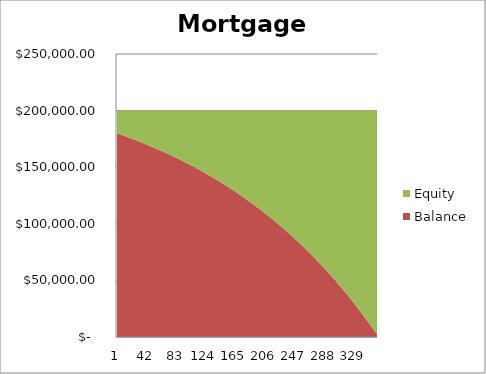
| Category | Balance | Equity |
|---|---|---|
| 0 | 180000 | 20000 |
| 1 | 179773.535 | 20226.465 |
| 2 | 179546.173 | 20453.827 |
| 3 | 179317.912 | 20682.088 |
| 4 | 179088.746 | 20911.254 |
| 5 | 178858.674 | 21141.326 |
| 6 | 178627.691 | 21372.309 |
| 7 | 178395.794 | 21604.206 |
| 8 | 178162.979 | 21837.021 |
| 9 | 177929.242 | 22070.758 |
| 10 | 177694.58 | 22305.42 |
| 11 | 177458.989 | 22541.011 |
| 12 | 177222.466 | 22777.534 |
| 13 | 176985.006 | 23014.994 |
| 14 | 176746.607 | 23253.393 |
| 15 | 176507.263 | 23492.737 |
| 16 | 176266.973 | 23733.027 |
| 17 | 176025.731 | 23974.269 |
| 18 | 175783.534 | 24216.466 |
| 19 | 175540.379 | 24459.621 |
| 20 | 175296.261 | 24703.739 |
| 21 | 175051.177 | 24948.823 |
| 22 | 174805.123 | 25194.877 |
| 23 | 174558.094 | 25441.906 |
| 24 | 174310.088 | 25689.912 |
| 25 | 174061.101 | 25938.899 |
| 26 | 173811.127 | 26188.873 |
| 27 | 173560.164 | 26439.836 |
| 28 | 173308.208 | 26691.792 |
| 29 | 173055.255 | 26944.745 |
| 30 | 172801.3 | 27198.7 |
| 31 | 172546.34 | 27453.66 |
| 32 | 172290.37 | 27709.63 |
| 33 | 172033.388 | 27966.612 |
| 34 | 171775.388 | 28224.612 |
| 35 | 171516.367 | 28483.633 |
| 36 | 171256.321 | 28743.679 |
| 37 | 170995.245 | 29004.755 |
| 38 | 170733.136 | 29266.864 |
| 39 | 170469.99 | 29530.01 |
| 40 | 170205.802 | 29794.198 |
| 41 | 169940.568 | 30059.432 |
| 42 | 169674.284 | 30325.716 |
| 43 | 169406.946 | 30593.054 |
| 44 | 169138.55 | 30861.45 |
| 45 | 168869.092 | 31130.908 |
| 46 | 168598.567 | 31401.433 |
| 47 | 168326.971 | 31673.029 |
| 48 | 168054.3 | 31945.7 |
| 49 | 167780.55 | 32219.45 |
| 50 | 167505.716 | 32494.284 |
| 51 | 167229.794 | 32770.206 |
| 52 | 166952.78 | 33047.22 |
| 53 | 166674.67 | 33325.33 |
| 54 | 166395.458 | 33604.542 |
| 55 | 166115.142 | 33884.858 |
| 56 | 165833.716 | 34166.284 |
| 57 | 165551.176 | 34448.824 |
| 58 | 165267.517 | 34732.483 |
| 59 | 164982.736 | 35017.264 |
| 60 | 164696.827 | 35303.173 |
| 61 | 164409.787 | 35590.213 |
| 62 | 164121.611 | 35878.389 |
| 63 | 163832.293 | 36167.707 |
| 64 | 163541.831 | 36458.169 |
| 65 | 163250.219 | 36749.781 |
| 66 | 162957.452 | 37042.548 |
| 67 | 162663.527 | 37336.473 |
| 68 | 162368.438 | 37631.562 |
| 69 | 162072.182 | 37927.818 |
| 70 | 161774.752 | 38225.248 |
| 71 | 161476.145 | 38523.855 |
| 72 | 161176.356 | 38823.644 |
| 73 | 160875.381 | 39124.619 |
| 74 | 160573.214 | 39426.786 |
| 75 | 160269.851 | 39730.149 |
| 76 | 159965.288 | 40034.712 |
| 77 | 159659.518 | 40340.482 |
| 78 | 159352.539 | 40647.461 |
| 79 | 159044.344 | 40955.656 |
| 80 | 158734.929 | 41265.071 |
| 81 | 158424.29 | 41575.71 |
| 82 | 158112.421 | 41887.579 |
| 83 | 157799.317 | 42200.683 |
| 84 | 157484.974 | 42515.026 |
| 85 | 157169.387 | 42830.613 |
| 86 | 156852.551 | 43147.449 |
| 87 | 156534.46 | 43465.54 |
| 88 | 156215.111 | 43784.889 |
| 89 | 155894.497 | 44105.503 |
| 90 | 155572.614 | 44427.386 |
| 91 | 155249.457 | 44750.543 |
| 92 | 154925.021 | 45074.979 |
| 93 | 154599.301 | 45400.699 |
| 94 | 154272.291 | 45727.709 |
| 95 | 153943.987 | 46056.013 |
| 96 | 153614.383 | 46385.617 |
| 97 | 153283.475 | 46716.525 |
| 98 | 152951.257 | 47048.743 |
| 99 | 152617.724 | 47382.276 |
| 100 | 152282.87 | 47717.13 |
| 101 | 151946.692 | 48053.308 |
| 102 | 151609.182 | 48390.818 |
| 103 | 151270.337 | 48729.663 |
| 104 | 150930.15 | 49069.85 |
| 105 | 150588.616 | 49411.384 |
| 106 | 150245.731 | 49754.269 |
| 107 | 149901.489 | 50098.511 |
| 108 | 149555.883 | 50444.117 |
| 109 | 149208.91 | 50791.09 |
| 110 | 148860.564 | 51139.436 |
| 111 | 148510.838 | 51489.162 |
| 112 | 148159.728 | 51840.272 |
| 113 | 147807.229 | 52192.771 |
| 114 | 147453.334 | 52546.666 |
| 115 | 147098.038 | 52901.962 |
| 116 | 146741.336 | 53258.664 |
| 117 | 146383.222 | 53616.778 |
| 118 | 146023.69 | 53976.31 |
| 119 | 145662.736 | 54337.264 |
| 120 | 145300.352 | 54699.648 |
| 121 | 144936.534 | 55063.466 |
| 122 | 144571.276 | 55428.724 |
| 123 | 144204.572 | 55795.428 |
| 124 | 143836.417 | 56163.583 |
| 125 | 143466.804 | 56533.196 |
| 126 | 143095.728 | 56904.272 |
| 127 | 142723.183 | 57276.817 |
| 128 | 142349.164 | 57650.836 |
| 129 | 141973.664 | 58026.336 |
| 130 | 141596.678 | 58403.322 |
| 131 | 141218.2 | 58781.8 |
| 132 | 140838.223 | 59161.777 |
| 133 | 140456.743 | 59543.257 |
| 134 | 140073.752 | 59926.248 |
| 135 | 139689.246 | 60310.754 |
| 136 | 139303.217 | 60696.783 |
| 137 | 138915.66 | 61084.34 |
| 138 | 138526.57 | 61473.43 |
| 139 | 138135.939 | 61864.061 |
| 140 | 137743.762 | 62256.238 |
| 141 | 137350.032 | 62649.968 |
| 142 | 136954.744 | 63045.256 |
| 143 | 136557.892 | 63442.108 |
| 144 | 136159.468 | 63840.532 |
| 145 | 135759.467 | 64240.533 |
| 146 | 135357.883 | 64642.117 |
| 147 | 134954.71 | 65045.29 |
| 148 | 134549.94 | 65450.06 |
| 149 | 134143.569 | 65856.431 |
| 150 | 133735.588 | 66264.412 |
| 151 | 133325.993 | 66674.007 |
| 152 | 132914.777 | 67085.223 |
| 153 | 132501.933 | 67498.067 |
| 154 | 132087.454 | 67912.546 |
| 155 | 131671.335 | 68328.665 |
| 156 | 131253.569 | 68746.431 |
| 157 | 130834.149 | 69165.851 |
| 158 | 130413.069 | 69586.931 |
| 159 | 129990.322 | 70009.678 |
| 160 | 129565.902 | 70434.098 |
| 161 | 129139.802 | 70860.198 |
| 162 | 128712.015 | 71287.985 |
| 163 | 128282.535 | 71717.465 |
| 164 | 127851.355 | 72148.645 |
| 165 | 127418.468 | 72581.532 |
| 166 | 126983.867 | 73016.133 |
| 167 | 126547.547 | 73452.453 |
| 168 | 126109.499 | 73890.501 |
| 169 | 125669.717 | 74330.283 |
| 170 | 125228.194 | 74771.806 |
| 171 | 124784.924 | 75215.076 |
| 172 | 124339.899 | 75660.101 |
| 173 | 123893.113 | 76106.887 |
| 174 | 123444.558 | 76555.442 |
| 175 | 122994.227 | 77005.773 |
| 176 | 122542.114 | 77457.886 |
| 177 | 122088.212 | 77911.788 |
| 178 | 121632.512 | 78367.488 |
| 179 | 121175.009 | 78824.991 |
| 180 | 120715.695 | 79284.305 |
| 181 | 120254.563 | 79745.437 |
| 182 | 119791.605 | 80208.395 |
| 183 | 119326.815 | 80673.185 |
| 184 | 118860.185 | 81139.815 |
| 185 | 118391.708 | 81608.292 |
| 186 | 117921.377 | 82078.623 |
| 187 | 117449.184 | 82550.816 |
| 188 | 116975.122 | 83024.878 |
| 189 | 116499.183 | 83500.817 |
| 190 | 116021.36 | 83978.64 |
| 191 | 115541.646 | 84458.354 |
| 192 | 115060.033 | 84939.967 |
| 193 | 114576.514 | 85423.486 |
| 194 | 114091.081 | 85908.919 |
| 195 | 113603.726 | 86396.274 |
| 196 | 113114.443 | 86885.557 |
| 197 | 112623.222 | 87376.778 |
| 198 | 112130.057 | 87869.943 |
| 199 | 111634.94 | 88365.06 |
| 200 | 111137.863 | 88862.137 |
| 201 | 110638.819 | 89361.181 |
| 202 | 110137.799 | 89862.201 |
| 203 | 109634.796 | 90365.204 |
| 204 | 109129.802 | 90870.198 |
| 205 | 108622.808 | 91377.192 |
| 206 | 108113.809 | 91886.191 |
| 207 | 107602.794 | 92397.206 |
| 208 | 107089.756 | 92910.244 |
| 209 | 106574.688 | 93425.312 |
| 210 | 106057.581 | 93942.419 |
| 211 | 105538.427 | 94461.573 |
| 212 | 105017.218 | 94982.782 |
| 213 | 104493.946 | 95506.054 |
| 214 | 103968.603 | 96031.397 |
| 215 | 103441.18 | 96558.82 |
| 216 | 102911.669 | 97088.331 |
| 217 | 102380.063 | 97619.937 |
| 218 | 101846.352 | 98153.648 |
| 219 | 101310.529 | 98689.471 |
| 220 | 100772.584 | 99227.416 |
| 221 | 100232.511 | 99767.489 |
| 222 | 99690.299 | 100309.701 |
| 223 | 99145.941 | 100854.059 |
| 224 | 98599.429 | 101400.571 |
| 225 | 98050.753 | 101949.247 |
| 226 | 97499.905 | 102500.095 |
| 227 | 96946.877 | 103053.123 |
| 228 | 96391.66 | 103608.34 |
| 229 | 95834.245 | 104165.755 |
| 230 | 95274.624 | 104725.376 |
| 231 | 94712.787 | 105287.213 |
| 232 | 94148.727 | 105851.273 |
| 233 | 93582.434 | 106417.566 |
| 234 | 93013.899 | 106986.101 |
| 235 | 92443.114 | 107556.886 |
| 236 | 91870.069 | 108129.931 |
| 237 | 91294.757 | 108705.243 |
| 238 | 90717.166 | 109282.834 |
| 239 | 90137.29 | 109862.71 |
| 240 | 89555.118 | 110444.882 |
| 241 | 88970.642 | 111029.358 |
| 242 | 88383.852 | 111616.148 |
| 243 | 87794.74 | 112205.26 |
| 244 | 87203.295 | 112796.705 |
| 245 | 86609.51 | 113390.49 |
| 246 | 86013.374 | 113986.626 |
| 247 | 85414.879 | 114585.121 |
| 248 | 84814.014 | 115185.986 |
| 249 | 84210.771 | 115789.229 |
| 250 | 83605.14 | 116394.86 |
| 251 | 82997.112 | 117002.888 |
| 252 | 82386.677 | 117613.323 |
| 253 | 81773.825 | 118226.175 |
| 254 | 81158.548 | 118841.452 |
| 255 | 80540.836 | 119459.164 |
| 256 | 79920.678 | 120079.322 |
| 257 | 79298.065 | 120701.935 |
| 258 | 78672.988 | 121327.012 |
| 259 | 78045.437 | 121954.563 |
| 260 | 77415.402 | 122584.598 |
| 261 | 76782.873 | 123217.127 |
| 262 | 76147.84 | 123852.16 |
| 263 | 75510.293 | 124489.707 |
| 264 | 74870.223 | 125129.777 |
| 265 | 74227.619 | 125772.381 |
| 266 | 73582.471 | 126417.529 |
| 267 | 72934.77 | 127065.23 |
| 268 | 72284.505 | 127715.495 |
| 269 | 71631.666 | 128368.334 |
| 270 | 70976.243 | 129023.757 |
| 271 | 70318.225 | 129681.775 |
| 272 | 69657.603 | 130342.397 |
| 273 | 68994.366 | 131005.634 |
| 274 | 68328.503 | 131671.497 |
| 275 | 67660.005 | 132339.995 |
| 276 | 66988.86 | 133011.14 |
| 277 | 66315.059 | 133684.941 |
| 278 | 65638.591 | 134361.409 |
| 279 | 64959.446 | 135040.554 |
| 280 | 64277.612 | 135722.388 |
| 281 | 63593.079 | 136406.921 |
| 282 | 62905.836 | 137094.164 |
| 283 | 62215.873 | 137784.127 |
| 284 | 61523.179 | 138476.821 |
| 285 | 60827.743 | 139172.257 |
| 286 | 60129.554 | 139870.446 |
| 287 | 59428.602 | 140571.398 |
| 288 | 58724.875 | 141275.125 |
| 289 | 58018.362 | 141981.638 |
| 290 | 57309.053 | 142690.947 |
| 291 | 56596.936 | 143403.064 |
| 292 | 55882.001 | 144117.999 |
| 293 | 55164.235 | 144835.765 |
| 294 | 54443.628 | 145556.372 |
| 295 | 53720.169 | 146279.831 |
| 296 | 52993.846 | 147006.154 |
| 297 | 52264.648 | 147735.352 |
| 298 | 51532.564 | 148467.436 |
| 299 | 50797.582 | 149202.418 |
| 300 | 50059.69 | 149940.31 |
| 301 | 49318.878 | 150681.122 |
| 302 | 48575.133 | 151424.867 |
| 303 | 47828.445 | 152171.555 |
| 304 | 47078.801 | 152921.199 |
| 305 | 46326.189 | 153673.811 |
| 306 | 45570.598 | 154429.402 |
| 307 | 44812.017 | 155187.983 |
| 308 | 44050.432 | 155949.568 |
| 309 | 43285.833 | 156714.167 |
| 310 | 42518.208 | 157481.792 |
| 311 | 41747.544 | 158252.456 |
| 312 | 40973.829 | 159026.171 |
| 313 | 40197.052 | 159802.948 |
| 314 | 39417.2 | 160582.8 |
| 315 | 38634.262 | 161365.738 |
| 316 | 37848.224 | 162151.776 |
| 317 | 37059.074 | 162940.926 |
| 318 | 36266.801 | 163733.199 |
| 319 | 35471.392 | 164528.608 |
| 320 | 34672.835 | 165327.165 |
| 321 | 33871.116 | 166128.884 |
| 322 | 33066.224 | 166933.776 |
| 323 | 32258.146 | 167741.854 |
| 324 | 31446.869 | 168553.131 |
| 325 | 30632.381 | 169367.619 |
| 326 | 29814.669 | 170185.331 |
| 327 | 28993.72 | 171006.28 |
| 328 | 28169.522 | 171830.478 |
| 329 | 27342.061 | 172657.939 |
| 330 | 26511.325 | 173488.675 |
| 331 | 25677.3 | 174322.7 |
| 332 | 24839.975 | 175160.025 |
| 333 | 23999.334 | 176000.666 |
| 334 | 23155.366 | 176844.634 |
| 335 | 22308.058 | 177691.942 |
| 336 | 21457.395 | 178542.605 |
| 337 | 20603.366 | 179396.634 |
| 338 | 19745.955 | 180254.045 |
| 339 | 18885.151 | 181114.849 |
| 340 | 18020.94 | 181979.06 |
| 341 | 17153.308 | 182846.692 |
| 342 | 16282.241 | 183717.759 |
| 343 | 15407.726 | 184592.274 |
| 344 | 14529.75 | 185470.25 |
| 345 | 13648.298 | 186351.702 |
| 346 | 12763.358 | 187236.642 |
| 347 | 11874.914 | 188125.086 |
| 348 | 10982.954 | 189017.046 |
| 349 | 10087.463 | 189912.537 |
| 350 | 9188.427 | 190811.573 |
| 351 | 8285.833 | 191714.167 |
| 352 | 7379.666 | 192620.334 |
| 353 | 6469.911 | 193530.089 |
| 354 | 5556.556 | 194443.444 |
| 355 | 4639.586 | 195360.414 |
| 356 | 3718.986 | 196281.014 |
| 357 | 2794.741 | 197205.259 |
| 358 | 1866.839 | 198133.161 |
| 359 | 935.263 | 199064.737 |